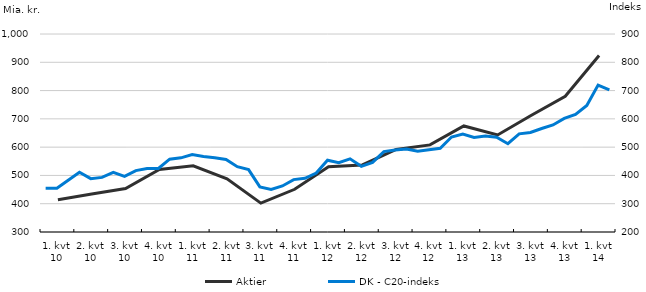
| Category | Aktier |
|---|---|
| 1. kvt 10 | 414 |
| 2. kvt 10 | 434 |
| 3. kvt 10 | 454 |
| 4. kvt 10 | 521 |
| 1. kvt 11 | 534 |
| 2. kvt 11 | 488 |
| 3. kvt 11 | 402 |
| 4. kvt 11 | 451 |
| 1. kvt 12 | 531 |
| 2. kvt 12 | 537 |
| 3. kvt 12 | 592 |
| 4. kvt 12 | 608 |
| 1. kvt 13 | 675 |
| 2. kvt 13 | 643 |
| 3. kvt 13 | 713 |
| 4. kvt 13 | 780 |
| 1. kvt 14 | 924 |